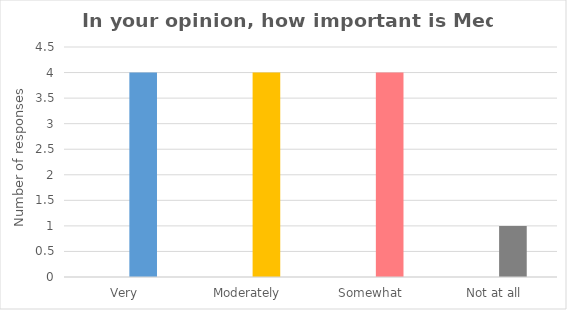
| Category | Series 0 | Series 1 |
|---|---|---|
| Very |  | 4 |
| Moderately |  | 4 |
| Somewhat |  | 4 |
| Not at all |  | 1 |